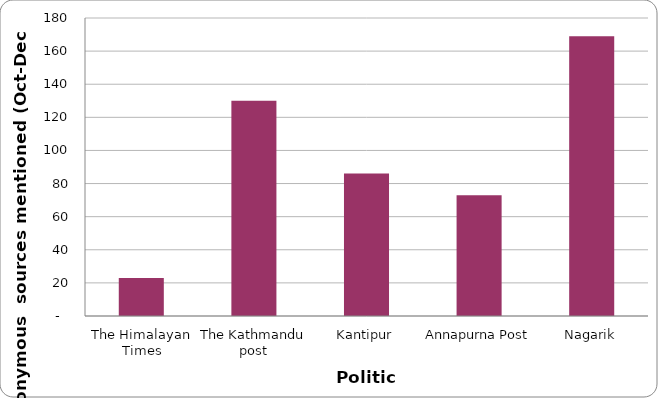
| Category | Politics |
|---|---|
| The Himalayan Times | 23 |
| The Kathmandu post | 130 |
| Kantipur | 86 |
| Annapurna Post | 73 |
| Nagarik | 169 |